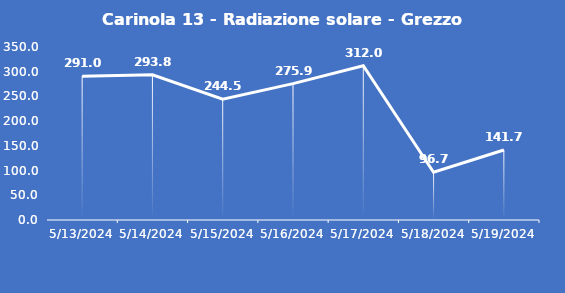
| Category | Carinola 13 - Radiazione solare - Grezzo (W/m2) |
|---|---|
| 5/13/24 | 291 |
| 5/14/24 | 293.8 |
| 5/15/24 | 244.5 |
| 5/16/24 | 275.9 |
| 5/17/24 | 312 |
| 5/18/24 | 96.7 |
| 5/19/24 | 141.7 |